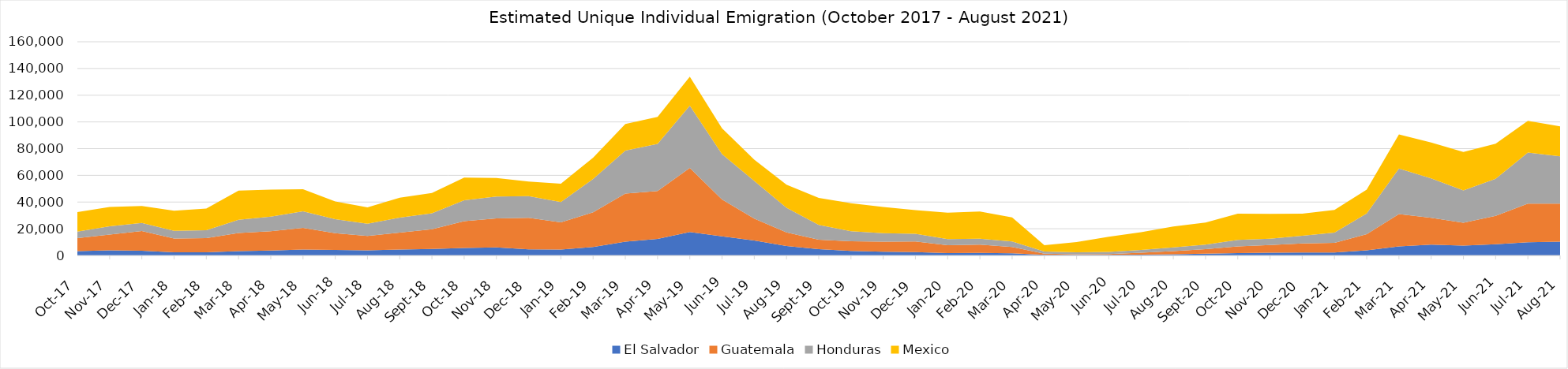
| Category | El Salvador | Guatemala | Honduras | Mexico |
|---|---|---|---|---|
| 2017-10-01 | 3291.625 | 9662.214 | 4912.008 | 14646.16 |
| 2017-11-01 | 3802.344 | 11890.426 | 6166.197 | 14389.445 |
| 2017-12-01 | 3499.802 | 14860.541 | 5926.981 | 12795.851 |
| 2018-01-01 | 2347.15 | 10418.882 | 5690.652 | 15027.658 |
| 2018-02-01 | 2294.843 | 10666.321 | 5989.89 | 16188.138 |
| 2018-03-01 | 3189.22 | 13691.174 | 9878.682 | 21735.861 |
| 2018-04-01 | 3706.743 | 14405.967 | 10980.244 | 20235.872 |
| 2018-05-01 | 4479.377 | 16136.397 | 12381.479 | 16644.053 |
| 2018-06-01 | 4100.285 | 12647.151 | 10340.602 | 13330.215 |
| 2018-07-01 | 3822.023 | 10774.632 | 9138.429 | 12319.278 |
| 2018-08-01 | 4413.212 | 12690.778 | 11223.886 | 14900.122 |
| 2018-09-01 | 4818.754 | 14793.828 | 11942.909 | 15267.884 |
| 2018-10-01 | 5620.396 | 20098.759 | 15555.729 | 17101.154 |
| 2018-11-01 | 6112.189 | 21631.724 | 16366.352 | 13969.242 |
| 2018-12-01 | 4517.162 | 23655.001 | 16245.486 | 10967.969 |
| 2019-01-01 | 4406.984 | 20344.695 | 15225.516 | 13741.232 |
| 2019-02-01 | 6315.623 | 25948.93 | 25039.835 | 15835.302 |
| 2019-03-01 | 10265.492 | 36033.938 | 32272.731 | 19933.586 |
| 2019-04-01 | 12378.765 | 35928.672 | 35261.766 | 20122.23 |
| 2019-05-01 | 17523.554 | 47963.091 | 46712.658 | 21702.271 |
| 2019-06-01 | 14250.046 | 27613.907 | 33970.585 | 19338.769 |
| 2019-07-01 | 11221.961 | 16388.507 | 28222.677 | 15887.735 |
| 2019-08-01 | 7057.046 | 10268.226 | 18324.266 | 17388.658 |
| 2019-09-01 | 4791.157 | 6943.988 | 11156.923 | 20218.243 |
| 2019-10-01 | 3385.73 | 7309.503 | 7524.846 | 20947.878 |
| 2019-11-01 | 2771.957 | 7627.176 | 6336.885 | 19576 |
| 2019-12-01 | 2516.773 | 7931.276 | 5828.077 | 17744.511 |
| 2020-01-01 | 1790.306 | 5828.633 | 4667.825 | 19735.006 |
| 2020-02-01 | 1972.371 | 6178.271 | 4454.979 | 20372.263 |
| 2020-03-01 | 1666.056 | 4705.644 | 4047.329 | 18035.636 |
| 2020-04-01 | 480.287 | 790.733 | 1643.086 | 4807.797 |
| 2020-05-01 | 397.964 | 441.329 | 1478.44 | 7672.41 |
| 2020-06-01 | 429.337 | 623.606 | 1653.421 | 11285.91 |
| 2020-07-01 | 632.641 | 1402.252 | 2105.452 | 13284.693 |
| 2020-08-01 | 918.079 | 2386.348 | 2804.875 | 15515.191 |
| 2020-09-01 | 1303.36 | 3384.89 | 3436.252 | 16581.248 |
| 2020-10-01 | 1807.833 | 5053.425 | 4810.632 | 19560.828 |
| 2020-11-01 | 2049.383 | 5737.352 | 4771.102 | 18580.836 |
| 2020-12-01 | 2171.148 | 6786.325 | 5788.325 | 16590.899 |
| 2021-01-01 | 2147.325 | 7325.78 | 7618.427 | 17046.362 |
| 2021-02-01 | 3798.606 | 12138.507 | 15481.454 | 17944.578 |
| 2021-03-01 | 6840.66 | 24222.588 | 34064.381 | 25527.458 |
| 2021-04-01 | 8067.156 | 20182.823 | 29438.227 | 26847.356 |
| 2021-05-01 | 7403.406 | 17147.923 | 24120.654 | 28839.747 |
| 2021-06-01 | 8409.868 | 21196.93 | 27758.631 | 26312.756 |
| 2021-07-01 | 9956.541 | 28842.719 | 38300.181 | 23764.284 |
| 2021-08-01 | 10291.979 | 28543.938 | 35437.558 | 22424.188 |